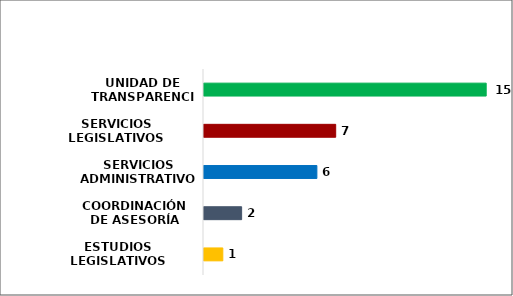
| Category | Series 0 |
|---|---|
| ESTUDIOS LEGISLATIVOS | 1 |
| COORDINACIÓN DE ASESORÍA | 2 |
| SERVICIOS ADMINISTRATIVOS | 6 |
| SERVICIOS LEGISLATIVOS | 7 |
| UNIDAD DE TRANSPARENCIA | 15 |